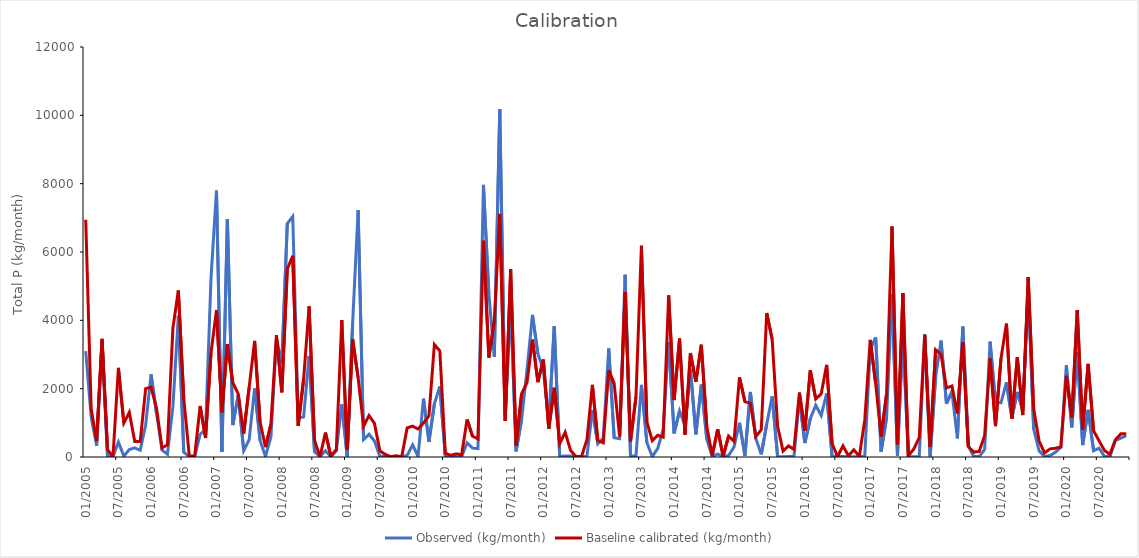
| Category | Observed (kg/month) | Baseline calibrated (kg/month) |
|---|---|---|
| 2005-01-01 | 3099.889 | 6942 |
| 2005-02-01 | 1167.859 | 1411 |
| 2005-03-01 | 329.281 | 466.5 |
| 2005-04-01 | 3354.049 | 3458 |
| 2005-05-01 | 27.587 | 214.3 |
| 2005-06-01 | 17.255 | 8.106 |
| 2005-07-01 | 432.681 | 2609 |
| 2005-08-01 | 26.086 | 992.9 |
| 2005-09-01 | 217.172 | 1305 |
| 2005-10-01 | 267.134 | 451.2 |
| 2005-11-01 | 197.337 | 451.7 |
| 2005-12-01 | 937.928 | 2001 |
| 2006-01-01 | 2416.104 | 2046 |
| 2006-02-01 | 1270.451 | 1426 |
| 2006-03-01 | 203.375 | 262.6 |
| 2006-04-01 | 80.176 | 359.9 |
| 2006-05-01 | 1472.258 | 3768 |
| 2006-06-01 | 4139.101 | 4874 |
| 2006-07-01 | 136.298 | 1710 |
| 2006-08-01 | 18.373 | 47.16 |
| 2006-09-01 | 6.72 | 32.56 |
| 2006-10-01 | 667.412 | 1493 |
| 2006-11-01 | 809.18 | 556.9 |
| 2006-12-01 | 5249.001 | 3052 |
| 2007-01-01 | 7795.938 | 4294 |
| 2007-02-01 | 144.902 | 1309 |
| 2007-03-01 | 6965.066 | 3303 |
| 2007-04-01 | 933.636 | 2179 |
| 2007-05-01 | 1818.948 | 1844 |
| 2007-06-01 | 183.855 | 686.5 |
| 2007-07-01 | 504.785 | 2039 |
| 2007-08-01 | 2007.567 | 3397 |
| 2007-09-01 | 486.009 | 1032 |
| 2007-10-01 | 15.502 | 287.8 |
| 2007-11-01 | 593.033 | 968.5 |
| 2007-12-01 | 3444.708 | 3565 |
| 2008-01-01 | 2747.573 | 1894 |
| 2008-02-01 | 6834.413 | 5503 |
| 2008-03-01 | 7040.088 | 5888 |
| 2008-04-01 | 1143.773 | 910.5 |
| 2008-05-01 | 1173.323 | 2282 |
| 2008-06-01 | 2961.893 | 4407 |
| 2008-07-01 | 154.114 | 488.7 |
| 2008-08-01 | 10.787 | 3.871 |
| 2008-09-01 | 184.735 | 715.3 |
| 2008-10-01 | 8.871 | 21.93 |
| 2008-11-01 | 180.698 | 220.8 |
| 2008-12-01 | 1540.399 | 4006 |
| 2009-01-01 | 20.049 | 205.8 |
| 2009-02-01 | 3946.227 | 3442 |
| 2009-03-01 | 7222.745 | 2321 |
| 2009-04-01 | 509.589 | 901.9 |
| 2009-05-01 | 664.22 | 1214 |
| 2009-06-01 | 468.569 | 983 |
| 2009-07-01 | 12.594 | 177.9 |
| 2009-08-01 | 11.221 | 75.36 |
| 2009-09-01 | 4.627 | 10.49 |
| 2009-10-01 | 7.534 | 36.93 |
| 2009-11-01 | 5.969 | 4.894 |
| 2009-12-01 | 46.82 | 851.2 |
| 2010-01-01 | 355.169 | 903.2 |
| 2010-02-01 | 14.569 | 818.8 |
| 2010-03-01 | 1705.972 | 995.1 |
| 2010-04-01 | 442.289 | 1205 |
| 2010-05-01 | 1556.119 | 3291 |
| 2010-06-01 | 2062.56 | 3103 |
| 2010-07-01 | 34.57 | 113.5 |
| 2010-08-01 | 25.692 | 48.01 |
| 2010-09-01 | 9.713 | 91.35 |
| 2010-10-01 | 10.341 | 66.28 |
| 2010-11-01 | 414.57 | 1097 |
| 2010-12-01 | 259.137 | 608.1 |
| 2011-01-01 | 245.373 | 529.4 |
| 2011-02-01 | 7965.133 | 6329 |
| 2011-03-01 | 4768.088 | 2913 |
| 2011-04-01 | 2935.837 | 3992 |
| 2011-05-01 | 10182.587 | 7117 |
| 2011-06-01 | 1222.483 | 1056 |
| 2011-07-01 | 4517.822 | 5495 |
| 2011-08-01 | 166.178 | 332.4 |
| 2011-09-01 | 1091.057 | 1848 |
| 2011-10-01 | 2545.862 | 2182 |
| 2011-11-01 | 4159.289 | 3437 |
| 2011-12-01 | 3015.934 | 2191 |
| 2012-01-01 | 2561.368 | 2853 |
| 2012-02-01 | 965.921 | 823.1 |
| 2012-03-01 | 3828.964 | 2025 |
| 2012-04-01 | 16.389 | 390.1 |
| 2012-05-01 | 25.957 | 723.5 |
| 2012-06-01 | 31.576 | 193.4 |
| 2012-07-01 | 16.498 | 9.486 |
| 2012-08-01 | 11.153 | 17.45 |
| 2012-09-01 | 14.037 | 502.6 |
| 2012-10-01 | 1369.957 | 2112 |
| 2012-11-01 | 387.608 | 482.1 |
| 2012-12-01 | 553.243 | 416.4 |
| 2013-01-01 | 3174.986 | 2538 |
| 2013-02-01 | 563.189 | 2140 |
| 2013-03-01 | 536.614 | 604 |
| 2013-04-01 | 5332.076 | 4831 |
| 2013-05-01 | 30.331 | 453 |
| 2013-06-01 | 40.209 | 1761 |
| 2013-07-01 | 2112.886 | 6182 |
| 2013-08-01 | 419.768 | 1023 |
| 2013-09-01 | 9.283 | 480.1 |
| 2013-10-01 | 254.893 | 637.4 |
| 2013-11-01 | 809.154 | 583.4 |
| 2013-12-01 | 3366.528 | 4729 |
| 2014-01-01 | 689.602 | 1667 |
| 2014-02-01 | 1348.693 | 3465 |
| 2014-03-01 | 928.57 | 654.9 |
| 2014-04-01 | 2569.786 | 3043 |
| 2014-05-01 | 664.271 | 2201 |
| 2014-06-01 | 2117.96 | 3285 |
| 2014-07-01 | 522.377 | 895.7 |
| 2014-08-01 | 9.98 | 38.31 |
| 2014-09-01 | 86.767 | 810.5 |
| 2014-10-01 | 13.226 | 19.84 |
| 2014-11-01 | 46.309 | 610.3 |
| 2014-12-01 | 291.165 | 461.1 |
| 2015-01-01 | 1001.947 | 2333 |
| 2015-02-01 | 42.987 | 1624 |
| 2015-03-01 | 1902.516 | 1568 |
| 2015-04-01 | 544.626 | 595.9 |
| 2015-05-01 | 76.7 | 796.6 |
| 2015-06-01 | 961.379 | 4215 |
| 2015-07-01 | 1774.534 | 3445 |
| 2015-08-01 | 11.501 | 897.5 |
| 2015-09-01 | 7.741 | 172.6 |
| 2015-10-01 | 18.24 | 323.5 |
| 2015-11-01 | 14.656 | 222.9 |
| 2015-12-01 | 1715.006 | 1885 |
| 2016-01-01 | 409.522 | 770.4 |
| 2016-02-01 | 1121.13 | 2534 |
| 2016-03-01 | 1515.522 | 1698 |
| 2016-04-01 | 1213.958 | 1847 |
| 2016-05-01 | 1858.715 | 2698 |
| 2016-06-01 | 16.408 | 394.7 |
| 2016-07-01 | 11.324 | 12.93 |
| 2016-08-01 | 13.18 | 324.5 |
| 2016-09-01 | 7.473 | 35.69 |
| 2016-10-01 | 8.588 | 210.8 |
| 2016-11-01 | 8.034 | 16.67 |
| 2016-12-01 | 25.843 | 1085 |
| 2017-01-01 | 3159.566 | 3428 |
| 2017-02-01 | 3497.534 | 2149 |
| 2017-03-01 | 150.043 | 598.4 |
| 2017-04-01 | 1148.459 | 1847 |
| 2017-05-01 | 4759.073 | 6745 |
| 2017-06-01 | 38.222 | 373.6 |
| 2017-07-01 | 3616.837 | 4795 |
| 2017-08-01 | 7.426 | 35.31 |
| 2017-09-01 | 8.032 | 234.7 |
| 2017-10-01 | 12.208 | 569.7 |
| 2017-11-01 | 3588.317 | 3575 |
| 2017-12-01 | 17.321 | 294.5 |
| 2018-01-01 | 2335.889 | 3141 |
| 2018-02-01 | 3405.855 | 3000 |
| 2018-03-01 | 1560.129 | 2023 |
| 2018-04-01 | 1915.049 | 2081 |
| 2018-05-01 | 545.235 | 1279 |
| 2018-06-01 | 3816.161 | 3365 |
| 2018-07-01 | 328.205 | 308.1 |
| 2018-08-01 | 13.318 | 144.5 |
| 2018-09-01 | 11.555 | 163 |
| 2018-10-01 | 219.844 | 629.9 |
| 2018-11-01 | 3376.141 | 2886 |
| 2018-12-01 | 1611.862 | 903.9 |
| 2019-01-01 | 1585.366 | 2879 |
| 2019-02-01 | 2181.349 | 3902 |
| 2019-03-01 | 1138.989 | 1126 |
| 2019-04-01 | 1903.871 | 2921 |
| 2019-05-01 | 1365.996 | 1228 |
| 2019-06-01 | 4981.833 | 5263 |
| 2019-07-01 | 819.046 | 1410 |
| 2019-08-01 | 178.809 | 466.8 |
| 2019-09-01 | 11.623 | 119.7 |
| 2019-10-01 | 44.057 | 238.7 |
| 2019-11-01 | 138.831 | 258.3 |
| 2019-12-01 | 282.711 | 297.6 |
| 2020-01-01 | 2682.638 | 2377 |
| 2020-02-01 | 868.72 | 1154 |
| 2020-03-01 | 3070.601 | 4295 |
| 2020-04-01 | 348.324 | 806.8 |
| 2020-05-01 | 1378.949 | 2729 |
| 2020-06-01 | 181.837 | 766.6 |
| 2020-07-01 | 255.916 | 474.7 |
| 2020-08-01 | 17.047 | 188.7 |
| 2020-09-01 | 17.855 | 78.91 |
| 2020-10-01 | 480.102 | 505.4 |
| 2020-11-01 | 551.198 | 677.3 |
| 2020-12-01 | 626.755 | 676.9 |